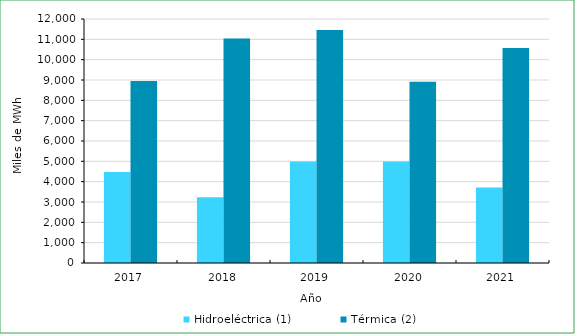
| Category | Hidroeléctrica (1) | Térmica (2) |
|---|---|---|
| 2017.0 | 4474.488 | 8949.925 |
| 2018.0 | 3239.331 | 11040.821 |
| 2019.0 | 4994.024 | 11456.649 |
| 2020.0 | 4995.921 | 8914.002 |
| 2021.0 | 3714.343 | 10576.521 |